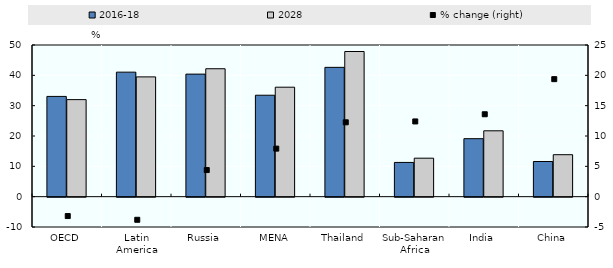
| Category | 2016-18 | 2028 |
|---|---|---|
| OECD | 33.053 | 31.996 |
| Latin America | 41.052 | 39.487 |
| Russia | 40.401 | 42.173 |
| MENA | 33.44 | 36.088 |
| Thailand | 42.629 | 47.855 |
| Sub-Saharan Africa | 11.287 | 12.687 |
| India | 19.117 | 21.714 |
| China | 11.591 | 13.837 |